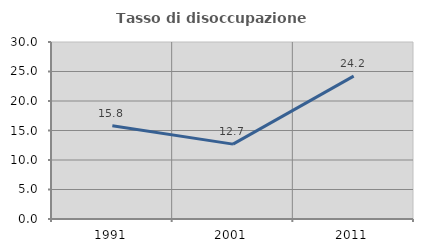
| Category | Tasso di disoccupazione giovanile  |
|---|---|
| 1991.0 | 15.789 |
| 2001.0 | 12.69 |
| 2011.0 | 24.214 |